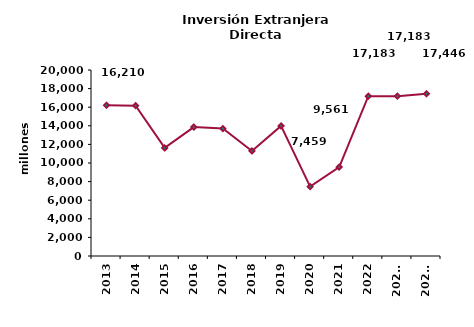
| Category | Series 0 |
|---|---|
| 2013 | 16210.419 |
| 2014 | 16168.702 |
| 2015 | 11620.533 |
| 2016 | 13857.938 |
| 2017 | 13700.88 |
| 2018 | 11298.693 |
| 2019 | 13989.154 |
| 2020 | 7458.625 |
| 2021 | 9561.335 |
| 2022 | 17182.521 |
| 2022* | 17182.521 |
| 2023* | 17446.182 |